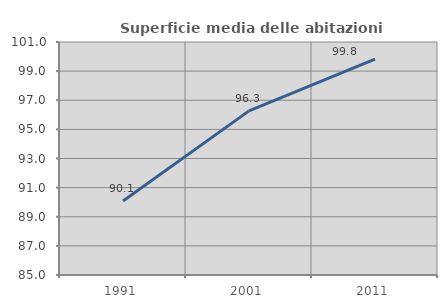
| Category | Superficie media delle abitazioni occupate |
|---|---|
| 1991.0 | 90.077 |
| 2001.0 | 96.271 |
| 2011.0 | 99.817 |